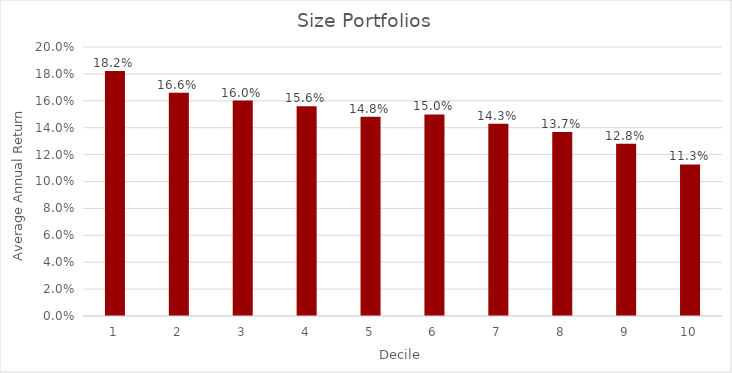
| Category | Series 0 |
|---|---|
| 0 | 0.182 |
| 1 | 0.166 |
| 2 | 0.16 |
| 3 | 0.156 |
| 4 | 0.148 |
| 5 | 0.15 |
| 6 | 0.143 |
| 7 | 0.137 |
| 8 | 0.128 |
| 9 | 0.113 |